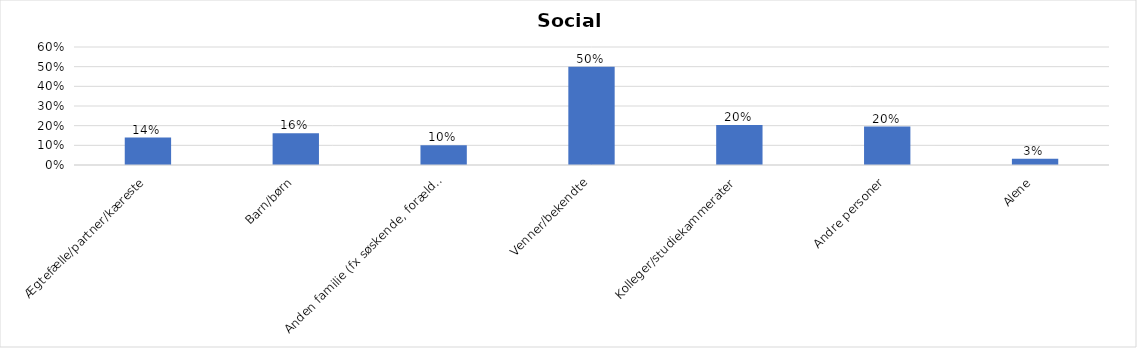
| Category | % |
|---|---|
| Ægtefælle/partner/kæreste | 0.139 |
| Barn/børn | 0.161 |
| Anden familie (fx søskende, forældre) | 0.101 |
| Venner/bekendte | 0.499 |
| Kolleger/studiekammerater | 0.203 |
| Andre personer | 0.196 |
| Alene | 0.032 |